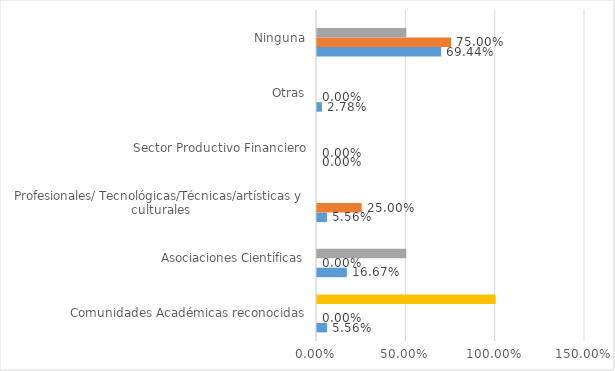
| Category | Series 0 | Series 1 | Series 2 | Series 3 |
|---|---|---|---|---|
| Comunidades Académicas reconocidas | 0.056 | 0 | 0 | 1 |
| Asociaciones Científicas | 0.167 | 0 | 0.5 | 0 |
| Profesionales/ Tecnológicas/Técnicas/artísticas y culturales | 0.056 | 0.25 | 0 | 0 |
| Sector Productivo Financiero | 0 | 0 | 0 | 0 |
| Otras | 0.028 | 0 | 0 | 0 |
| Ninguna | 0.694 | 0.75 | 0.5 | 0 |